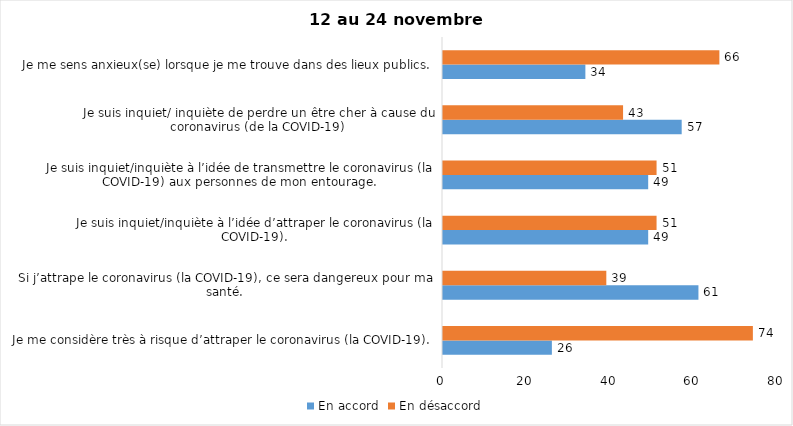
| Category | En accord | En désaccord |
|---|---|---|
| Je me considère très à risque d’attraper le coronavirus (la COVID-19). | 26 | 74 |
| Si j’attrape le coronavirus (la COVID-19), ce sera dangereux pour ma santé. | 61 | 39 |
| Je suis inquiet/inquiète à l’idée d’attraper le coronavirus (la COVID-19). | 49 | 51 |
| Je suis inquiet/inquiète à l’idée de transmettre le coronavirus (la COVID-19) aux personnes de mon entourage. | 49 | 51 |
| Je suis inquiet/ inquiète de perdre un être cher à cause du coronavirus (de la COVID-19) | 57 | 43 |
| Je me sens anxieux(se) lorsque je me trouve dans des lieux publics. | 34 | 66 |